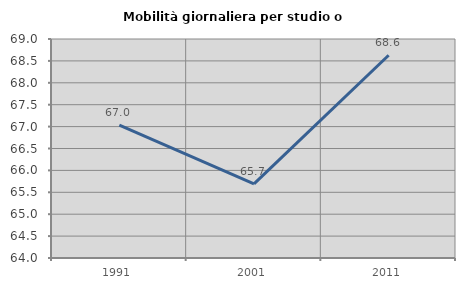
| Category | Mobilità giornaliera per studio o lavoro |
|---|---|
| 1991.0 | 67.031 |
| 2001.0 | 65.694 |
| 2011.0 | 68.629 |